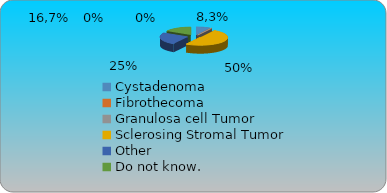
| Category | Series 0 | Series 1 | Series 2 | Series 3 |
|---|---|---|---|---|
| Cystadenoma | 0.083 |  |  |  |
| Fibrothecoma | 0 |  |  |  |
| Granulosa cell Tumor | 0 |  |  |  |
| Sclerosing Stromal Tumor | 0.5 |  |  |  |
| Other | 0.25 |  |  |  |
| Do not know. | 0.167 |  |  |  |